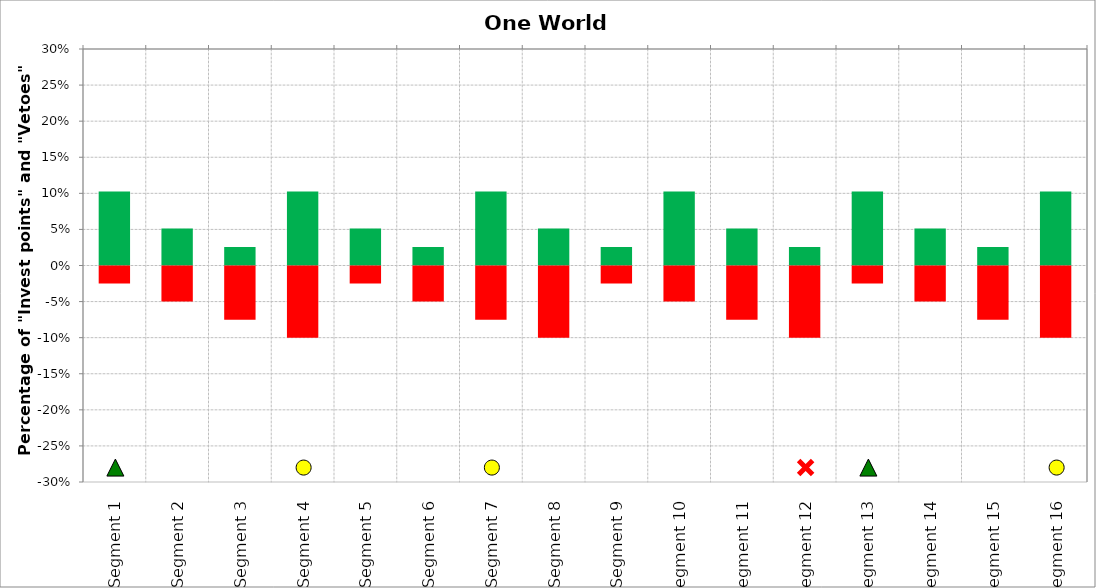
| Category | Invest | Veto |
|---|---|---|
| Segment 1 | 0.103 | -0.025 |
| Segment 2 | 0.051 | -0.05 |
| Segment 3 | 0.026 | -0.075 |
| Segment 4 | 0.103 | -0.1 |
| Segment 5 | 0.051 | -0.025 |
| Segment 6 | 0.026 | -0.05 |
| Segment 7 | 0.103 | -0.075 |
| Segment 8 | 0.051 | -0.1 |
| Segment 9 | 0.026 | -0.025 |
| Segment 10 | 0.103 | -0.05 |
| Segment 11 | 0.051 | -0.075 |
| Segment 12 | 0.026 | -0.1 |
| Segment 13 | 0.103 | -0.025 |
| Segment 14 | 0.051 | -0.05 |
| Segment 15 | 0.026 | -0.075 |
| Segment 16 | 0.103 | -0.1 |